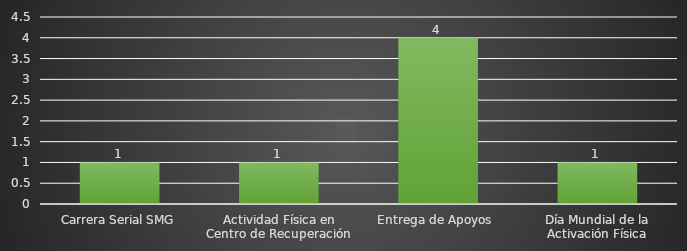
| Category | INDICADOR  |
|---|---|
| Carrera Serial SMG | 1 |
| Actividad Física en Centro de Recuperación | 1 |
| Entrega de Apoyos  | 4 |
| Día Mundial de la Activación Física | 1 |